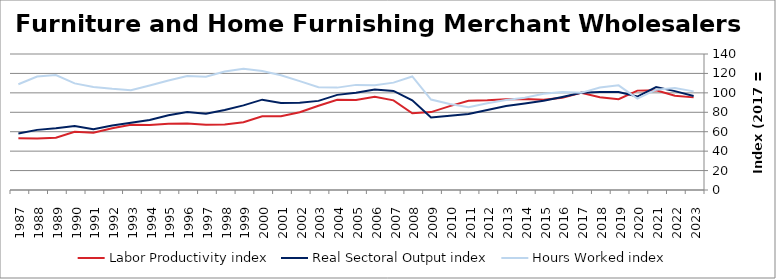
| Category | Labor Productivity index | Real Sectoral Output index | Hours Worked index |
|---|---|---|---|
| 2023.0 | 95.348 | 96.798 | 101.521 |
| 2022.0 | 96.957 | 101.768 | 104.962 |
| 2021.0 | 102.587 | 105.924 | 103.252 |
| 2020.0 | 102.299 | 96.185 | 94.023 |
| 2019.0 | 93.549 | 100.778 | 107.728 |
| 2018.0 | 95.487 | 100.819 | 105.584 |
| 2017.0 | 100 | 100 | 100 |
| 2016.0 | 95.032 | 95.757 | 100.763 |
| 2015.0 | 92.893 | 91.94 | 98.973 |
| 2014.0 | 93.712 | 89.036 | 95.01 |
| 2013.0 | 93.359 | 86.426 | 92.574 |
| 2012.0 | 92.37 | 82.423 | 89.232 |
| 2011.0 | 91.826 | 78.256 | 85.222 |
| 2010.0 | 86.343 | 76.45 | 88.542 |
| 2009.0 | 80.208 | 74.646 | 93.065 |
| 2008.0 | 78.959 | 92.262 | 116.848 |
| 2007.0 | 92.249 | 101.974 | 110.542 |
| 2006.0 | 95.979 | 103.516 | 107.853 |
| 2005.0 | 92.599 | 100.206 | 108.214 |
| 2004.0 | 92.909 | 97.921 | 105.395 |
| 2003.0 | 86.769 | 91.744 | 105.734 |
| 2002.0 | 79.999 | 89.7 | 112.127 |
| 2001.0 | 75.818 | 89.585 | 118.158 |
| 2000.0 | 75.927 | 92.996 | 122.481 |
| 1999.0 | 69.795 | 87.082 | 124.769 |
| 1998.0 | 67.507 | 82.322 | 121.945 |
| 1997.0 | 67.218 | 78.389 | 116.619 |
| 1996.0 | 68.43 | 80.275 | 117.31 |
| 1995.0 | 68.273 | 76.991 | 112.77 |
| 1994.0 | 67.038 | 72.125 | 107.588 |
| 1993.0 | 67.248 | 69.134 | 102.804 |
| 1992.0 | 63.659 | 66.321 | 104.182 |
| 1991.0 | 58.967 | 62.583 | 106.131 |
| 1990.0 | 60.02 | 65.875 | 109.755 |
| 1989.0 | 53.788 | 63.671 | 118.374 |
| 1988.0 | 52.982 | 61.899 | 116.831 |
| 1987.0 | 53.327 | 58.056 | 108.869 |